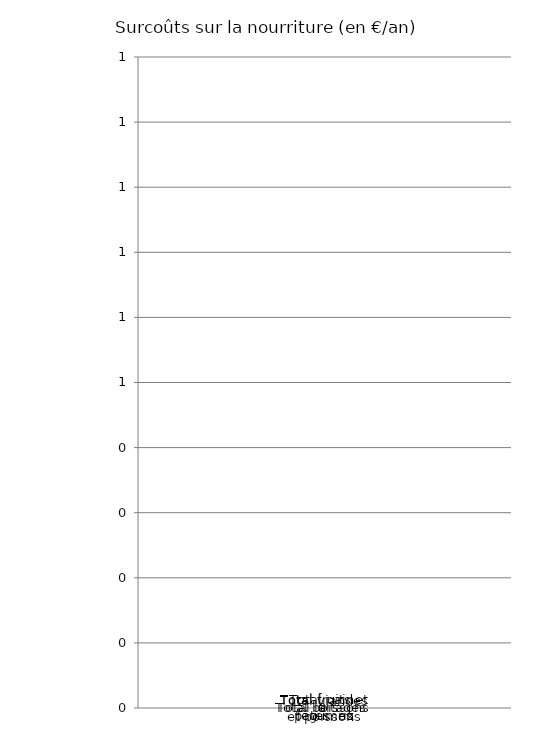
| Category | Total viandes et poissons | Total laitages | Total fruits et légumes | Total plats cuisinés | Total pain, pâtes, riz | Total boissons |
|---|---|---|---|---|---|---|
| 0 | 0 | 0 | 0 | 0 | 0 | 0 |